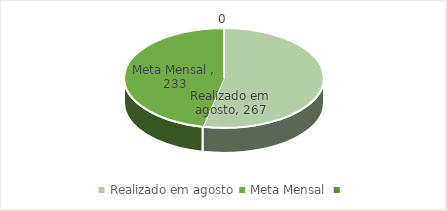
| Category | Series 0 |
|---|---|
| Realizado em agosto | 267 |
| Meta Mensal  | 233 |